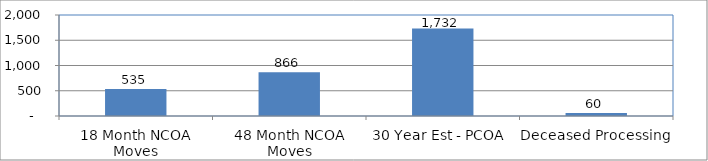
| Category | Series 0 |
|---|---|
| 18 Month NCOA Moves | 535 |
| 48 Month NCOA Moves | 866 |
| 30 Year Est - PCOA  | 1732 |
| Deceased Processing | 60 |